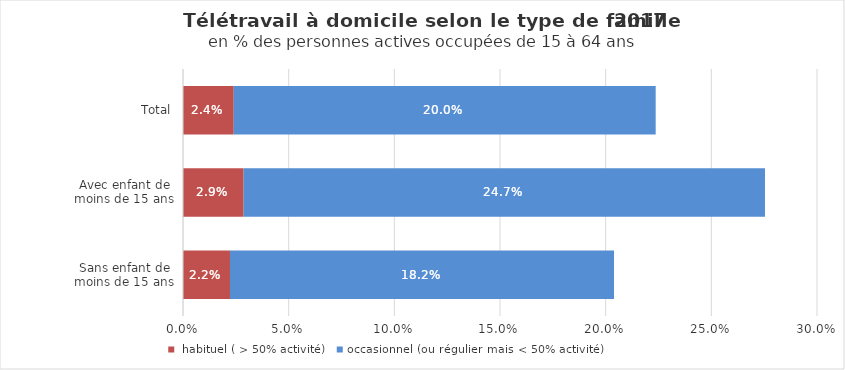
| Category |  habituel ( > 50% activité) | occasionnel (ou régulier mais < 50% activité) |
|---|---|---|
| Sans enfant de moins de 15 ans | 0.022 | 0.182 |
| Avec enfant de moins de 15 ans | 0.029 | 0.247 |
| Total | 0.024 | 0.2 |